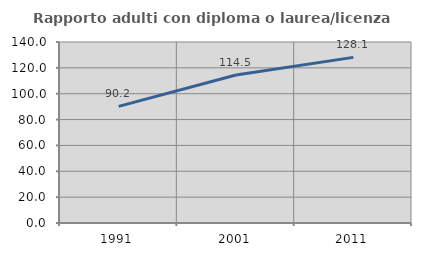
| Category | Rapporto adulti con diploma o laurea/licenza media  |
|---|---|
| 1991.0 | 90.206 |
| 2001.0 | 114.51 |
| 2011.0 | 128.107 |